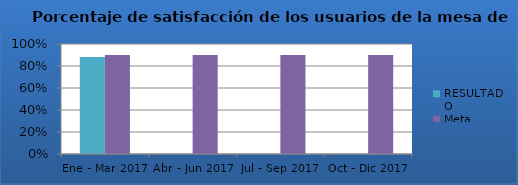
| Category | RESULTADO | Meta |
|---|---|---|
| Ene - Mar 2017 | 0.882 | 0.9 |
| Abr - Jun 2017 | 0 | 0.9 |
| Jul - Sep 2017 | 0 | 0.9 |
| Oct - Dic 2017 | 0 | 0.9 |